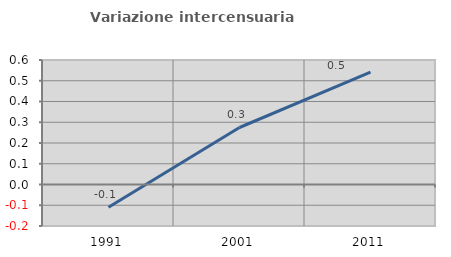
| Category | Variazione intercensuaria annua |
|---|---|
| 1991.0 | -0.109 |
| 2001.0 | 0.275 |
| 2011.0 | 0.541 |